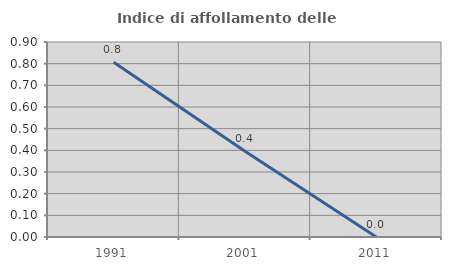
| Category | Indice di affollamento delle abitazioni  |
|---|---|
| 1991.0 | 0.806 |
| 2001.0 | 0.395 |
| 2011.0 | 0 |